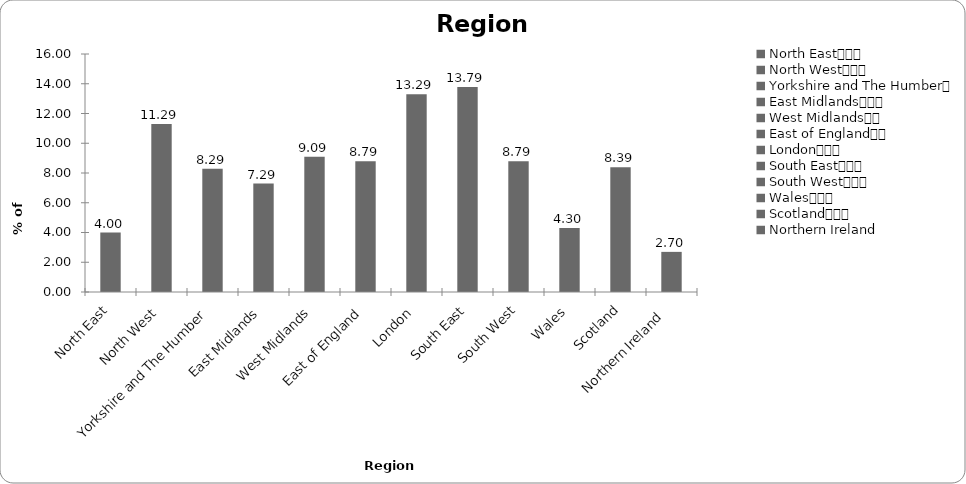
| Category | Region |
|---|---|
| North East			 | 3.996 |
| North West			 | 11.289 |
| Yorkshire and The Humber	 | 8.292 |
| East Midlands			 | 7.293 |
| West Midlands		 | 9.091 |
| East of England		 | 8.791 |
| London			 | 13.287 |
| South East			 | 13.786 |
| South West			 | 8.791 |
| Wales			 | 4.296 |
| Scotland			 | 8.392 |
| Northern Ireland  | 2.697 |